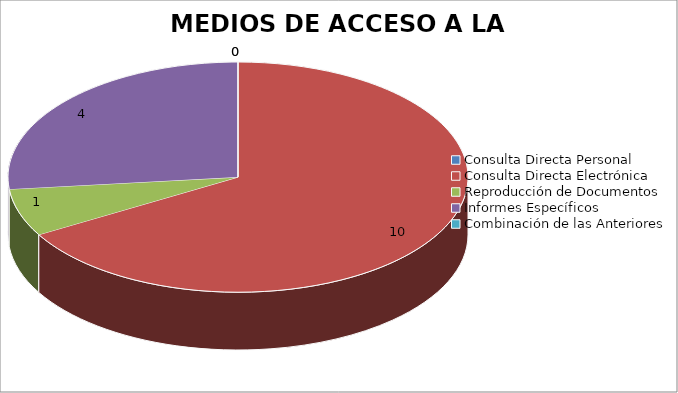
| Category | MEDIOS DE ACCESO A LA INFORMACIÓN |
|---|---|
| 0 | 0 |
| 1 | 10 |
| 2 | 1 |
| 3 | 4 |
| 4 | 0 |